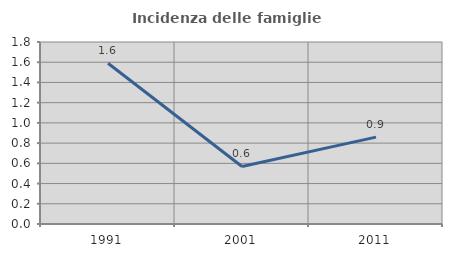
| Category | Incidenza delle famiglie numerose |
|---|---|
| 1991.0 | 1.59 |
| 2001.0 | 0.569 |
| 2011.0 | 0.859 |